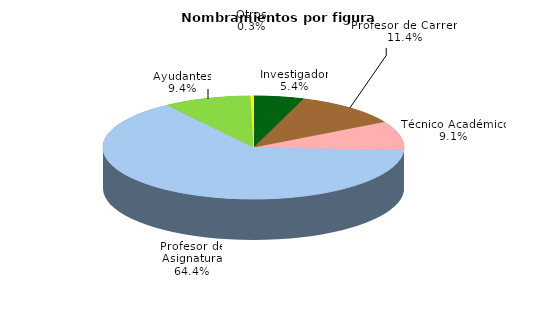
| Category | Series 0 |
|---|---|
| Investigador | 2727 |
| Profesor de Carrera | 5783 |
| Técnico Académico | 4603 |
| Profesor de Asignatura | 32736 |
| Ayudantes | 4782 |
| Otros | 163 |